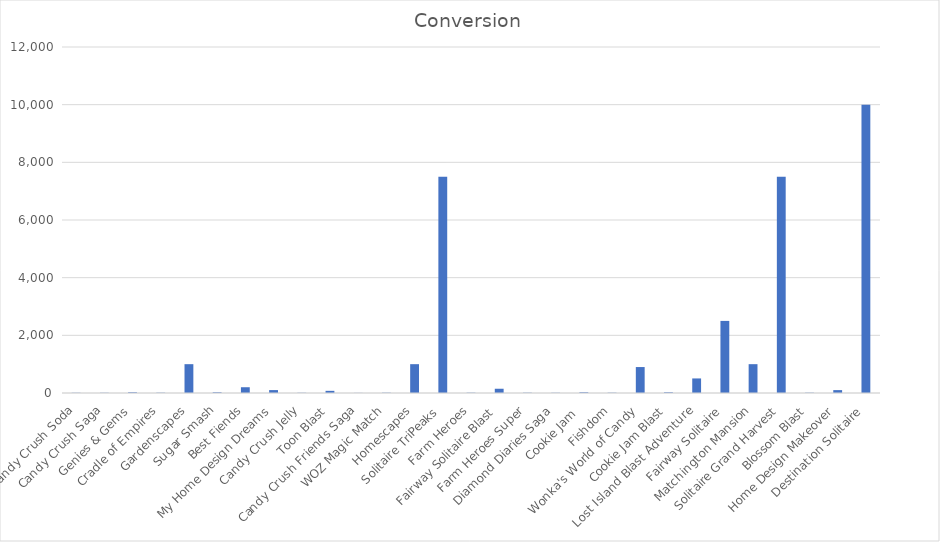
| Category | Conversion |
|---|---|
| Candy Crush Soda | 7.5 |
| Candy Crush Saga | 7.5 |
| Genies & Gems | 25 |
| Cradle of Empires | 10 |
| Gardenscapes | 1000 |
| Sugar Smash | 25 |
| Best Fiends | 200 |
| My Home Design Dreams | 101.01 |
| Candy Crush Jelly | 7.5 |
| Toon Blast | 75 |
| Candy Crush Friends Saga | 4.013 |
| WOZ Magic Match | 10 |
| Homescapes | 1000 |
| Solitaire TriPeaks | 7500 |
| Farm Heroes | 10 |
| ​​Fairway Solitaire Blast | 147.5 |
| Farm Heroes Super | 10 |
| Diamond Diaries Saga | 7.5 |
| Cookie Jam  | 25 |
| Fishdom | 10 |
| Wonka's World of Candy | 900 |
| Cookie Jam Blast | 25 |
| Lost Island Blast Adventure | 505.051 |
| ​​Fairway Solitaire | 2500 |
| Matchington Mansion | 1000 |
| Solitaire Grand Harvest | 7500 |
| Blossom Blast | 10 |
| Home Design Makeover | 100 |
| Destination Solitaire | 10000 |